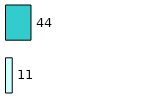
| Category | Series 0 | Series 1 |
|---|---|---|
| 0 | 11 | 44 |